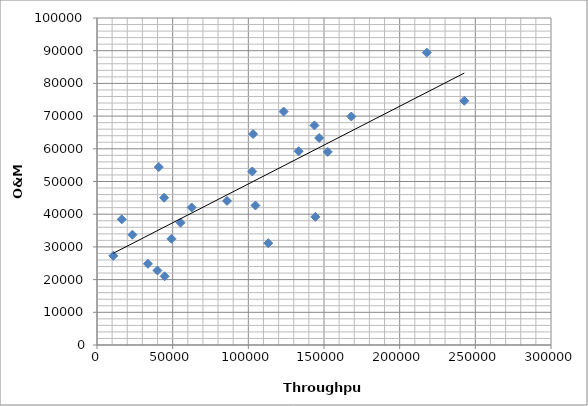
| Category | O&M Expense |
|---|---|
| 10785.1 | 27267.71 |
| 16363.439999999997 | 38429.53 |
| 23419.28 | 33732.4 |
| 33640.829999999994 | 24828.04 |
| 39924.56 | 22786.53 |
| 40795.90000000001 | 54427.86 |
| 44353.689999999995 | 45039.31 |
| 44717.31 | 21008.65 |
| 49214.700000000004 | 32484.12 |
| 55221.479999999996 | 37406.24 |
| 62559.5 | 42066.6 |
| 85918.58000000002 | 44053.56 |
| 102600.95 | 53067.45 |
| 103131.57999999999 | 64505.89 |
| 104708.22999999998 | 42662.61 |
| 113151.06 | 31131.72 |
| 123325.0 | 71387.22 |
| 133238.08 | 59257.35 |
| 143656.02000000002 | 67155.82 |
| 144291.15999999997 | 39189.17 |
| 146789.1 | 63306.08 |
| 152486.41999999998 | 59048.78 |
| 168024.87000000002 | 69874.13 |
| 217936.05000000002 | 89426.15 |
| 242723.97 | 74675.83 |